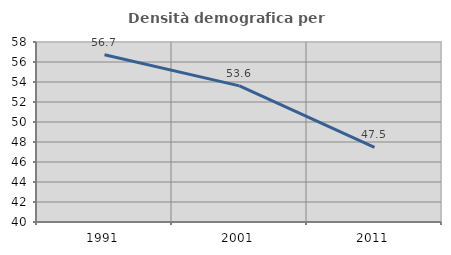
| Category | Densità demografica |
|---|---|
| 1991.0 | 56.718 |
| 2001.0 | 53.61 |
| 2011.0 | 47.454 |